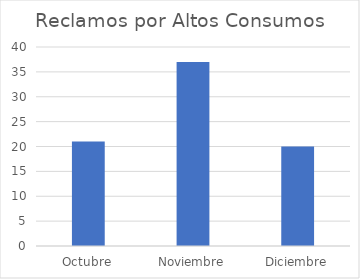
| Category | Reclamos por Altos Consumos |
|---|---|
| Octubre | 21 |
| Noviembre | 37 |
| Diciembre | 20 |